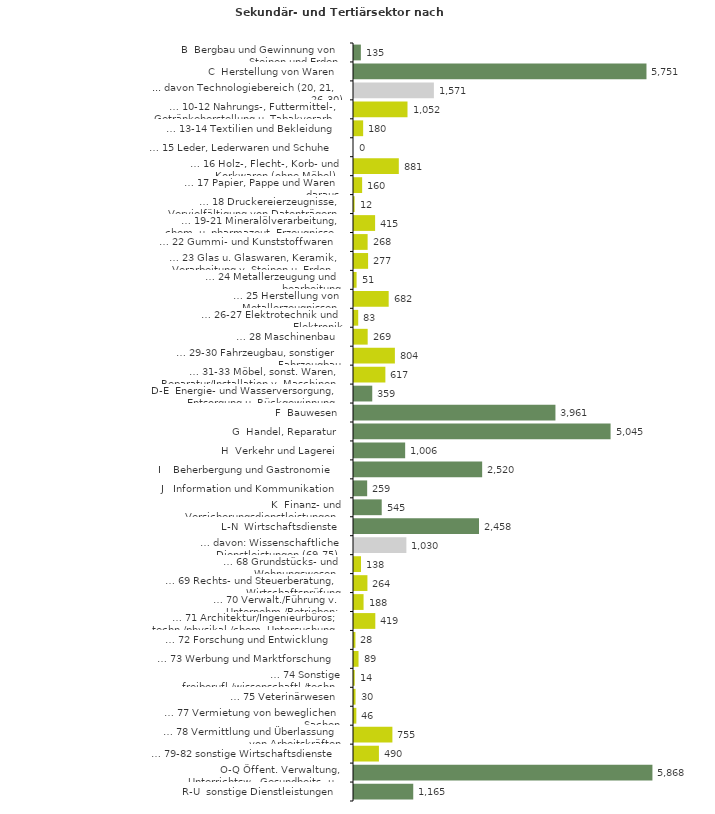
| Category | Series 0 |
|---|---|
| B  Bergbau und Gewinnung von Steinen und Erden | 135 |
| C  Herstellung von Waren | 5751 |
| ... davon Technologiebereich (20, 21, 26-30) | 1571 |
| … 10-12 Nahrungs-, Futtermittel-, Getränkeherstellung u. Tabakverarb. | 1052 |
| … 13-14 Textilien und Bekleidung | 180 |
| … 15 Leder, Lederwaren und Schuhe | 0 |
| … 16 Holz-, Flecht-, Korb- und Korkwaren (ohne Möbel)  | 881 |
| … 17 Papier, Pappe und Waren daraus  | 160 |
| … 18 Druckereierzeugnisse, Vervielfältigung von Datenträgern | 12 |
| … 19-21 Mineralölverarbeitung, chem. u. pharmazeut. Erzeugnisse | 415 |
| … 22 Gummi- und Kunststoffwaren | 268 |
| … 23 Glas u. Glaswaren, Keramik, Verarbeitung v. Steinen u. Erden  | 277 |
| … 24 Metallerzeugung und -bearbeitung | 51 |
| … 25 Herstellung von Metallerzeugnissen  | 682 |
| … 26-27 Elektrotechnik und Elektronik | 83 |
| … 28 Maschinenbau | 269 |
| … 29-30 Fahrzeugbau, sonstiger Fahrzeugbau | 804 |
| … 31-33 Möbel, sonst. Waren, Reparatur/Installation v. Maschinen | 617 |
| D-E  Energie- und Wasserversorgung, Entsorgung u. Rückgewinnung | 359 |
| F  Bauwesen | 3961 |
| G  Handel, Reparatur | 5045 |
| H  Verkehr und Lagerei | 1006 |
| I    Beherbergung und Gastronomie | 2520 |
| J   Information und Kommunikation | 259 |
| K  Finanz- und Versicherungsdienstleistungen | 545 |
| L-N  Wirtschaftsdienste | 2458 |
| … davon: Wissenschaftliche Dienstleistungen (69-75) | 1030 |
| … 68 Grundstücks- und Wohnungswesen  | 138 |
| … 69 Rechts- und Steuerberatung, Wirtschaftsprüfung | 264 |
| … 70 Verwalt./Führung v. Unternehm./Betrieben; Unternehmensberat. | 188 |
| … 71 Architektur/Ingenieurbüros; techn./physikal./chem. Untersuchung | 419 |
| … 72 Forschung und Entwicklung  | 28 |
| … 73 Werbung und Marktforschung | 89 |
| … 74 Sonstige freiberufl./wissenschaftl./techn. Tätigkeiten | 14 |
| … 75 Veterinärwesen | 30 |
| … 77 Vermietung von beweglichen Sachen  | 46 |
| … 78 Vermittlung und Überlassung von Arbeitskräften | 755 |
| … 79-82 sonstige Wirtschaftsdienste | 490 |
| O-Q Öffent. Verwaltung, Unterrichtsw., Gesundheits- u. Sozialwesen | 5868 |
| R-U  sonstige Dienstleistungen | 1165 |